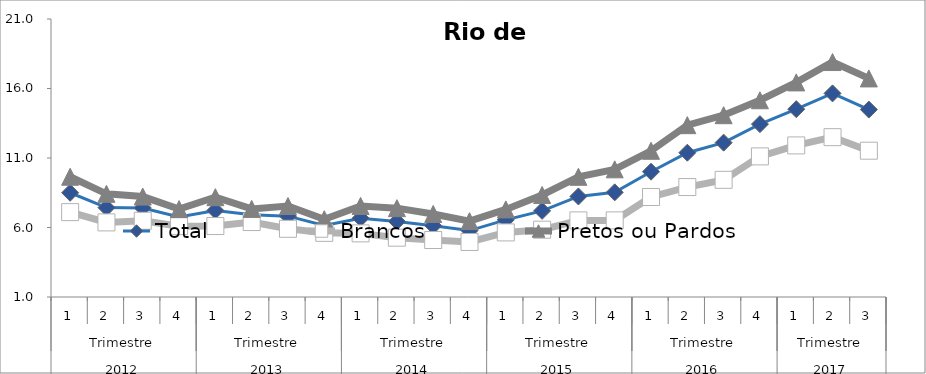
| Category | Total | Brancos | Pretos ou Pardos |
|---|---|---|---|
| 0 | 8.499 | 7.106 | 9.651 |
| 1 | 7.43 | 6.368 | 8.422 |
| 2 | 7.404 | 6.486 | 8.225 |
| 3 | 6.754 | 6.096 | 7.325 |
| 4 | 7.229 | 6.105 | 8.18 |
| 5 | 6.91 | 6.392 | 7.339 |
| 6 | 6.816 | 5.906 | 7.545 |
| 7 | 6.152 | 5.615 | 6.597 |
| 8 | 6.67 | 5.576 | 7.551 |
| 9 | 6.436 | 5.268 | 7.391 |
| 10 | 6.128 | 5.099 | 6.973 |
| 11 | 5.78 | 4.959 | 6.458 |
| 12 | 6.55 | 5.646 | 7.303 |
| 13 | 7.198 | 5.842 | 8.342 |
| 14 | 8.235 | 6.511 | 9.649 |
| 15 | 8.531 | 6.512 | 10.184 |
| 16 | 10.013 | 8.195 | 11.52 |
| 17 | 11.38 | 8.91 | 13.363 |
| 18 | 12.105 | 9.429 | 14.08 |
| 19 | 13.437 | 11.116 | 15.154 |
| 20 | 14.513 | 11.906 | 16.439 |
| 21 | 15.648 | 12.499 | 17.904 |
| 22 | 14.483 | 11.525 | 16.726 |